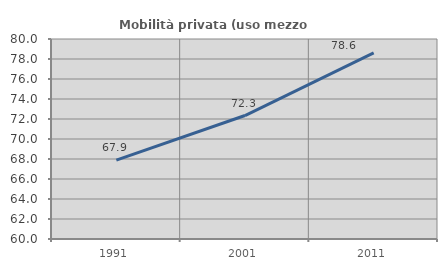
| Category | Mobilità privata (uso mezzo privato) |
|---|---|
| 1991.0 | 67.888 |
| 2001.0 | 72.347 |
| 2011.0 | 78.618 |